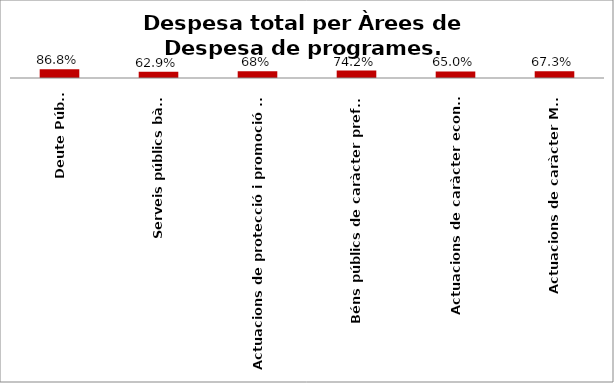
| Category | Series 0 |
|---|---|
| Deute Públic | 0.868 |
| Serveis públics bàsics | 0.629 |
| Actuacions de protecció i promoció social | 0.682 |
| Béns públics de caràcter preferent | 0.742 |
| Actuacions de caràcter econòmic | 0.65 |
| Actuacions de caràcter Marçal | 0.673 |